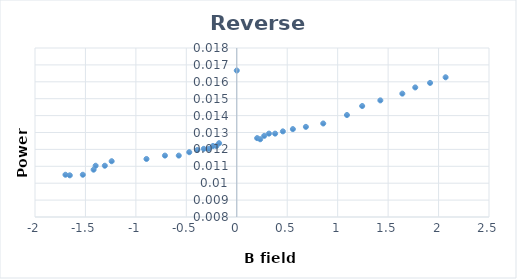
| Category | Series 0 |
|---|---|
| -0.1755 | 0.012 |
| -0.202 | 0.012 |
| -0.236 | 0.012 |
| -0.277 | 0.012 |
| -0.327 | 0.012 |
| -0.391 | 0.012 |
| -0.471 | 0.012 |
| -0.575 | 0.012 |
| -0.712 | 0.012 |
| -0.895 | 0.011 |
| -1.24 | 0.011 |
| -1.308 | 0.011 |
| -1.399 | 0.011 |
| -1.419 | 0.011 |
| -1.526 | 0.01 |
| -1.655 | 0.01 |
| -1.698 | 0.01 |
| 0.1711 | 0 |
| 0.202 | 0.013 |
| 0.232 | 0.013 |
| 0.272 | 0.013 |
| 0.319 | 0.013 |
| 0.38 | 0.013 |
| 0.457 | 0.013 |
| 0.556 | 0.013 |
| 0.685 | 0.013 |
| 0.857 | 0.014 |
| 1.092 | 0.014 |
| 1.243 | 0.015 |
| 1.423 | 0.015 |
| 1.641 | 0.015 |
| 1.769 | 0.016 |
| 1.916 | 0.016 |
| 2.07 | 0.016 |